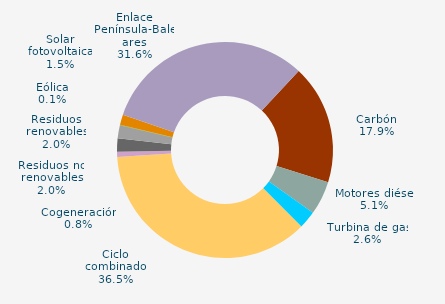
| Category | Series 0 |
|---|---|
| Carbón | 17.869 |
| Motores diésel | 5.06 |
| Turbina de gas | 2.641 |
| Ciclo combinado | 36.47 |
| Generación auxiliar | 0 |
| Cogeneración | 0.771 |
| Residuos no renovables | 1.969 |
| Residuos renovables | 1.969 |
| Eólica | 0.066 |
| Solar fotovoltaica | 1.532 |
| Otras renovables | 0.009 |
| Enlace Península-Baleares | 31.643 |